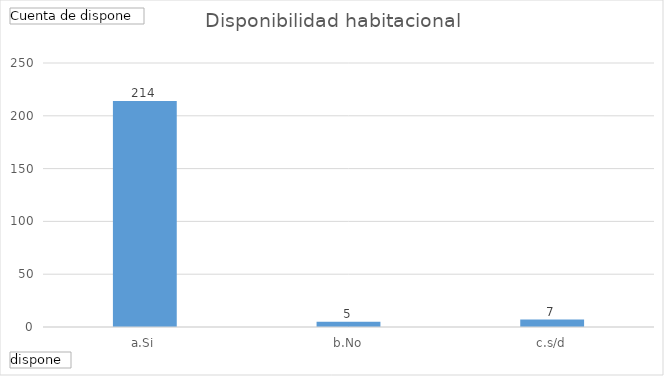
| Category | Total |
|---|---|
| a.Si | 214 |
| b.No | 5 |
| c.s/d | 7 |